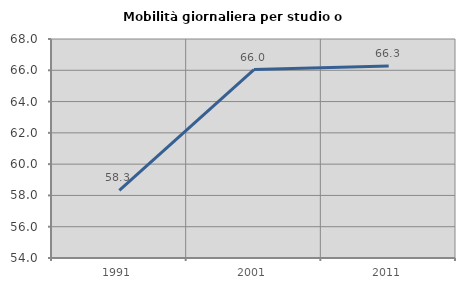
| Category | Mobilità giornaliera per studio o lavoro |
|---|---|
| 1991.0 | 58.33 |
| 2001.0 | 66.042 |
| 2011.0 | 66.27 |